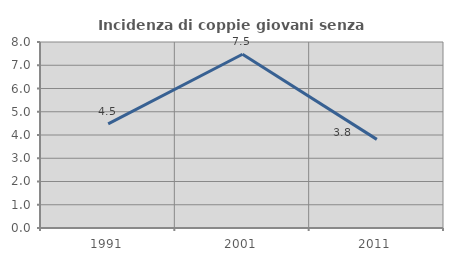
| Category | Incidenza di coppie giovani senza figli |
|---|---|
| 1991.0 | 4.478 |
| 2001.0 | 7.474 |
| 2011.0 | 3.812 |